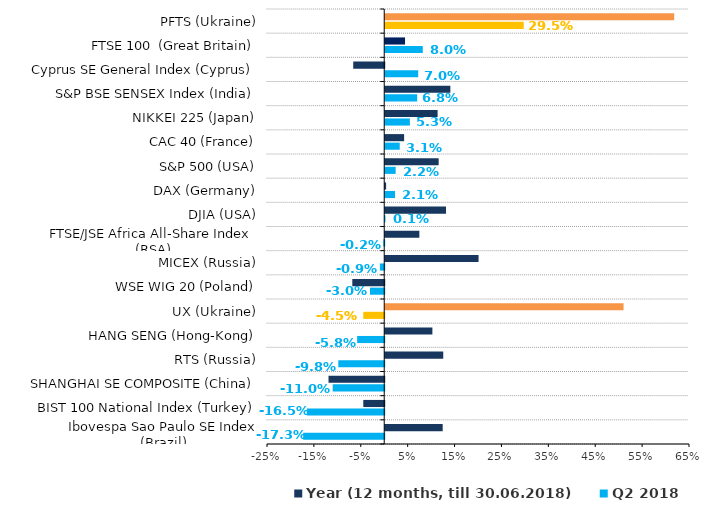
| Category | Q2 2018 | Year (12 months, till 30.06.2018) |
|---|---|---|
| Ibovespa Sao Paulo SE Index (Brazil) | -0.173 | 0.123 |
| BIST 100 National Index (Тurkey) | -0.165 | -0.045 |
| SHANGHAI SE COMPOSITE (China) | -0.11 | -0.119 |
| RTS (Russia) | -0.098 | 0.124 |
| HANG SENG (Hong-Kong) | -0.058 | 0.101 |
| UX (Ukraine) | -0.045 | 0.508 |
| WSE WIG 20 (Poland) | -0.03 | -0.068 |
| МICEX (Russia) | -0.009 | 0.199 |
| FTSE/JSE Africa All-Share Index  (RSA) | -0.002 | 0.073 |
| DJIA (USA) | 0.001 | 0.13 |
| DAX (Germany) | 0.021 | 0.002 |
| S&P 500 (USA) | 0.022 | 0.114 |
| CAC 40 (France) | 0.031 | 0.04 |
| NIKKEI 225 (Japan) | 0.053 | 0.112 |
| S&P BSE SENSEX Index (Іndia) | 0.068 | 0.139 |
| Cyprus SE General Index (Cyprus) | 0.07 | -0.066 |
| FTSE 100  (Great Britain) | 0.08 | 0.042 |
| PFTS (Ukraine) | 0.295 | 0.616 |